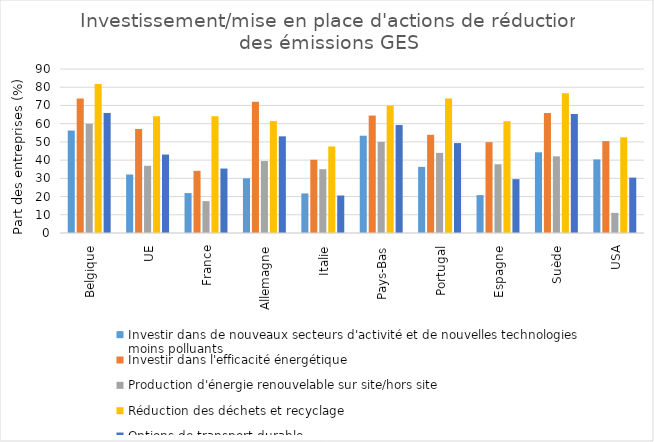
| Category | Investir dans de nouveaux secteurs d'activité et de nouvelles technologies moins polluants | Investir dans l'efficacité énergétique | Production d'énergie renouvelable sur site/hors site | Réduction des déchets et recyclage | Options de transport durable |
|---|---|---|---|---|---|
|   Belgique | 56.23 | 73.8 | 59.95 | 81.76 | 65.88 |
|   UE | 32.11 | 57.12 | 36.89 | 64.07 | 43.06 |
|   France | 21.91 | 34.13 | 17.49 | 64.09 | 35.37 |
|   Allemagne | 30.02 | 71.96 | 39.49 | 61.4 | 53.04 |
|   Italie | 21.72 | 40.19 | 35.01 | 47.49 | 20.59 |
|   Pays-Bas | 53.4 | 64.44 | 50 | 69.95 | 59.28 |
|   Portugal | 36.29 | 53.89 | 43.98 | 73.8 | 49.35 |
|   Espagne | 20.8 | 49.84 | 37.74 | 61.34 | 29.55 |
|   Suède | 44.28 | 65.85 | 42.06 | 76.76 | 65.31 |
|   USA | 40.37 | 50.44 | 11.06 | 52.54 | 30.38 |